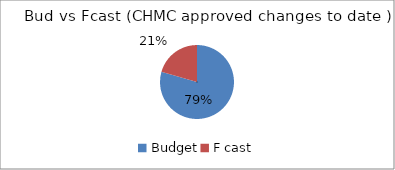
| Category | Series 2 | Series 3 | Series 1 | Series 0 |
|---|---|---|---|---|
| Budget | 2500 | 2500 | 2500 | 2500 |
| F cast | 646.904 | 646.904 | 646.904 | 646.904 |